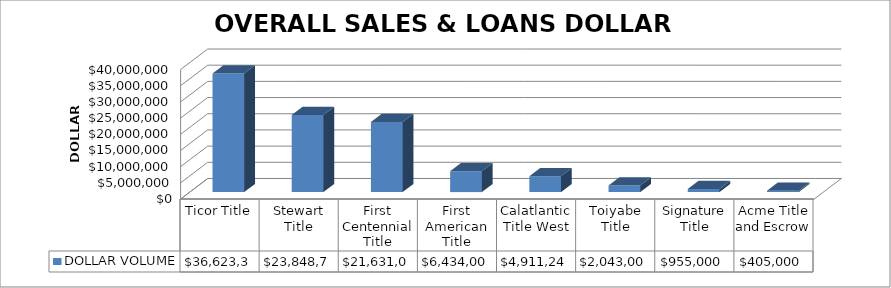
| Category | DOLLAR VOLUME |
|---|---|
| Ticor Title | 36623332.13 |
| Stewart Title | 23848734 |
| First Centennial Title | 21631030 |
| First American Title | 6434000 |
| Calatlantic Title West | 4911243 |
| Toiyabe Title | 2043000 |
| Signature Title | 955000 |
| Acme Title and Escrow | 405000 |